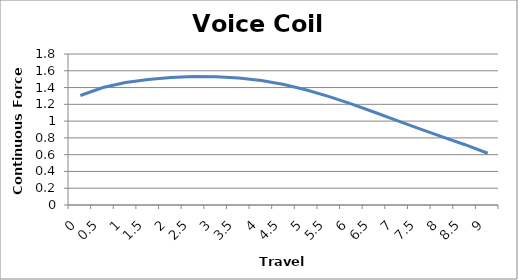
| Category | Series 0 |
|---|---|
| 0.0 | 1.306 |
| 0.5 | 1.4 |
| 1.0 | 1.459 |
| 1.5 | 1.497 |
| 2.0 | 1.52 |
| 2.5 | 1.531 |
| 3.0 | 1.53 |
| 3.5 | 1.515 |
| 4.0 | 1.484 |
| 4.5 | 1.436 |
| 5.0 | 1.371 |
| 5.5 | 1.293 |
| 6.0 | 1.202 |
| 6.5 | 1.105 |
| 7.0 | 1.006 |
| 7.5 | 0.908 |
| 8.0 | 0.813 |
| 8.5 | 0.719 |
| 9.0 | 0.617 |